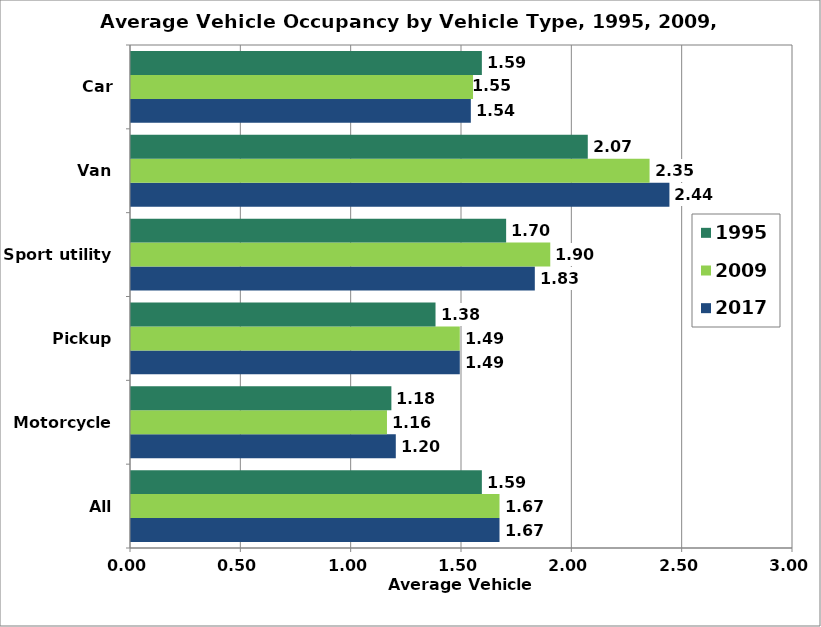
| Category | 2017 | 2009 | 1995 |
|---|---|---|---|
| All | 1.67 | 1.67 | 1.59 |
| Motorcycle | 1.2 | 1.16 | 1.18 |
| Pickup | 1.49 | 1.49 | 1.38 |
| Sport utility | 1.83 | 1.9 | 1.7 |
| Van | 2.44 | 2.35 | 2.07 |
| Car | 1.54 | 1.55 | 1.59 |